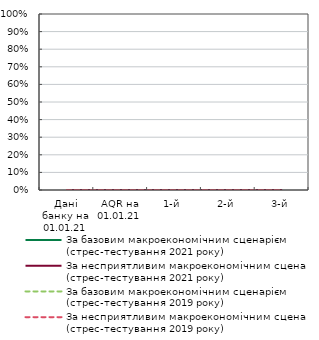
| Category | За базовим макроекономічним сценарієм (стрес-тестування 2021 року) | За несприятливим макроекономічним сценарієм (стрес-тестування 2021 року) | За базовим макроекономічним сценарієм (стрес-тестування 2019 року) | За несприятливим макроекономічним сценарієм (стрес-тестування 2019 року) |
|---|---|---|---|---|
| Дані банку на 01.01.21 | 0 | 0 | 0 | 0 |
| AQR на 01.01.21 | 0 | 0 | 0 | 0 |
| 1-й | 0 | 0 | 0 | 0 |
| 2-й | 0 | 0 | 0 | 0 |
| 3-й | 0 | 0 | 0 | 0 |